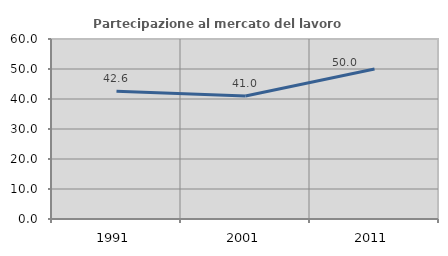
| Category | Partecipazione al mercato del lavoro  femminile |
|---|---|
| 1991.0 | 42.593 |
| 2001.0 | 41.026 |
| 2011.0 | 50 |